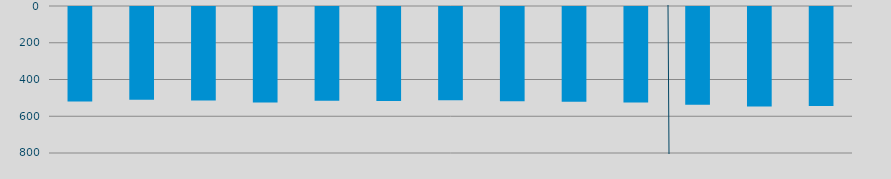
| Category | Energía a bajar | Energía a subir |
|---|---|---|
| M | 513.61 |  |
| A | 504.985 |  |
| M | 508.805 |  |
| J | 519.464 |  |
| J | 510.745 |  |
| A | 512.124 |  |
| S | 507.342 |  |
| O | 513.588 |  |
| N | 515.549 |  |
| D | 519.921 |  |
| E | 531.331 |  |
| F | 542.024 |  |
| M | 539.136 |  |